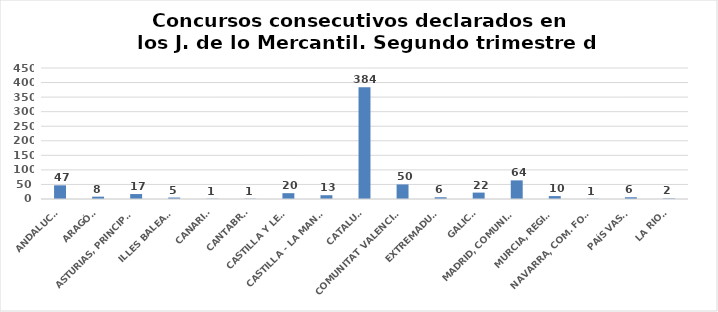
| Category | Series 0 |
|---|---|
| ANDALUCÍA | 47 |
| ARAGÓN | 8 |
| ASTURIAS, PRINCIPADO | 17 |
| ILLES BALEARS | 5 |
| CANARIAS | 1 |
| CANTABRIA | 1 |
| CASTILLA Y LEÓN | 20 |
| CASTILLA - LA MANCHA | 13 |
| CATALUÑA | 384 |
| COMUNITAT VALENCIANA | 50 |
| EXTREMADURA | 6 |
| GALICIA | 22 |
| MADRID, COMUNIDAD | 64 |
| MURCIA, REGIÓN | 10 |
| NAVARRA, COM. FORAL | 1 |
| PAÍS VASCO | 6 |
| LA RIOJA | 2 |